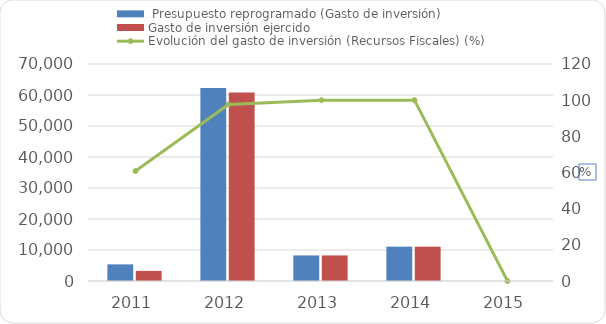
| Category |  Presupuesto reprogramado (Gasto de inversión) | Gasto de inversión ejercido |
|---|---|---|
| 2011 | 5365 | 3263 |
| 2012 | 62284.9 | 60803 |
| 2013 | 8247.4 | 8247.4 |
| 2014 | 11074.7 | 11074.7 |
| 2015 | 0 | 0 |